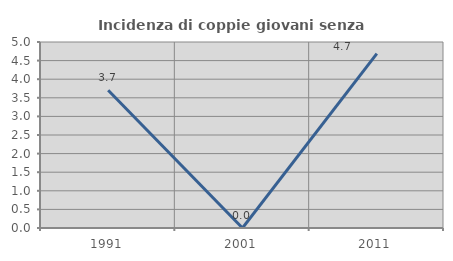
| Category | Incidenza di coppie giovani senza figli |
|---|---|
| 1991.0 | 3.704 |
| 2001.0 | 0 |
| 2011.0 | 4.688 |